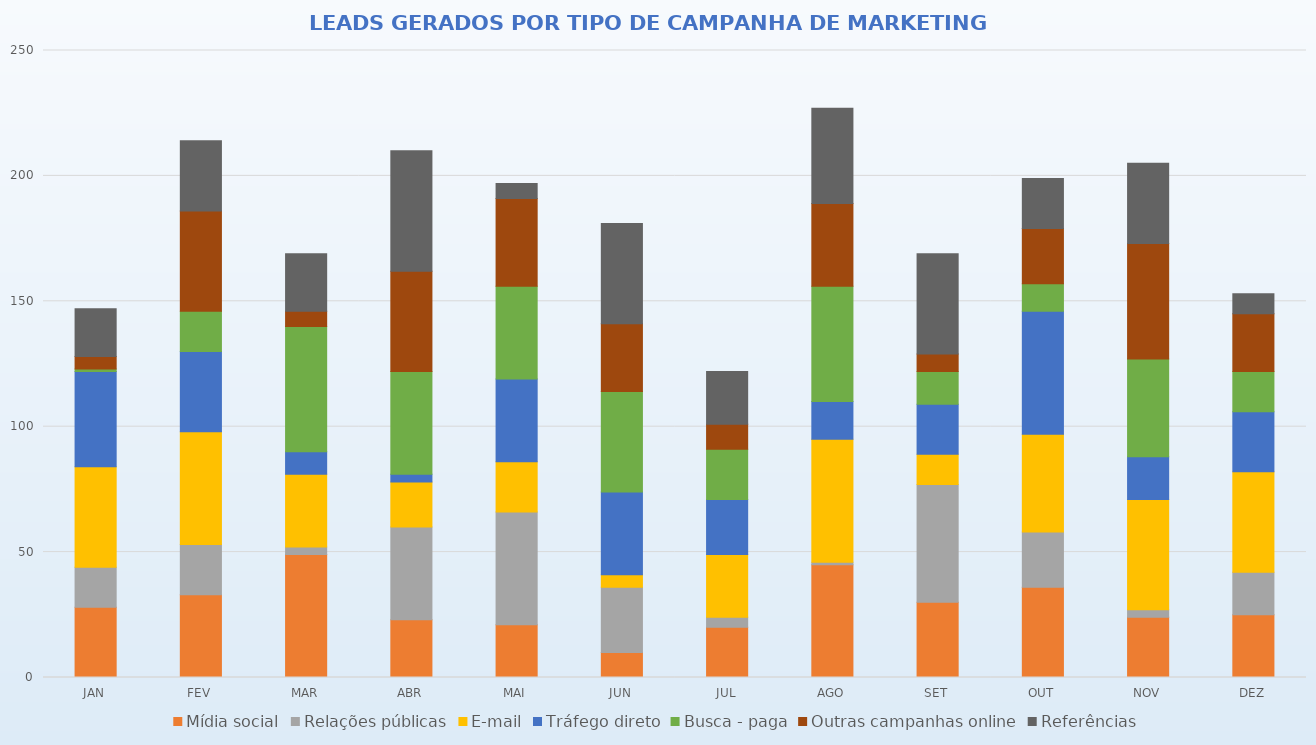
| Category | Mídia social | Relações públicas | E-mail | Tráfego direto | Busca - paga | Outras campanhas online | Referências |
|---|---|---|---|---|---|---|---|
| JAN | 28 | 16 | 40 | 38 | 1 | 5 | 19 |
| FEV | 33 | 20 | 45 | 32 | 16 | 40 | 28 |
| MAR | 49 | 3 | 29 | 9 | 50 | 6 | 23 |
| ABR | 23 | 37 | 18 | 3 | 41 | 40 | 48 |
| MAI | 21 | 45 | 20 | 33 | 37 | 35 | 6 |
| JUN | 10 | 26 | 5 | 33 | 40 | 27 | 40 |
| JUL | 20 | 4 | 25 | 22 | 20 | 10 | 21 |
| AGO | 45 | 1 | 49 | 15 | 46 | 33 | 38 |
| SET | 30 | 47 | 12 | 20 | 13 | 7 | 40 |
| OUT | 36 | 22 | 39 | 49 | 11 | 22 | 20 |
| NOV | 24 | 3 | 44 | 17 | 39 | 46 | 32 |
| DEZ | 25 | 17 | 40 | 24 | 16 | 23 | 8 |